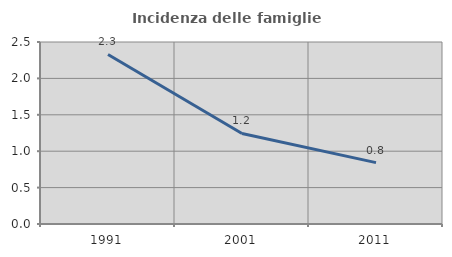
| Category | Incidenza delle famiglie numerose |
|---|---|
| 1991.0 | 2.329 |
| 2001.0 | 1.244 |
| 2011.0 | 0.843 |